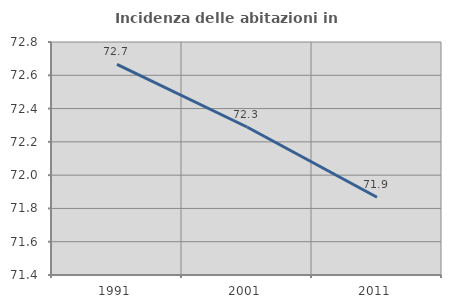
| Category | Incidenza delle abitazioni in proprietà  |
|---|---|
| 1991.0 | 72.665 |
| 2001.0 | 72.289 |
| 2011.0 | 71.867 |